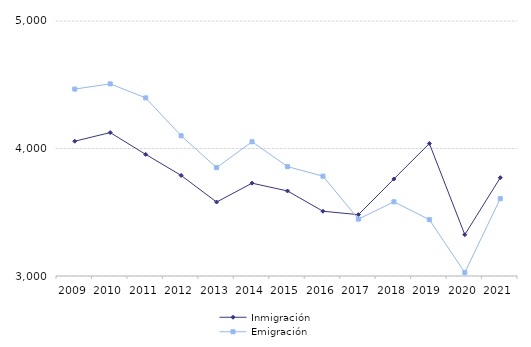
| Category | Inmigración | Emigración |
|---|---|---|
| 2009.0 | 4057 | 4466 |
| 2010.0 | 4125 | 4507 |
| 2011.0 | 3954 | 4397 |
| 2012.0 | 3789 | 4100 |
| 2013.0 | 3580 | 3850 |
| 2014.0 | 3728 | 4053 |
| 2015.0 | 3667 | 3858 |
| 2016.0 | 3508 | 3783 |
| 2017.0 | 3481 | 3446 |
| 2018.0 | 3761 | 3582 |
| 2019.0 | 4039 | 3442 |
| 2020.0 | 3324 | 3027 |
| 2021.0 | 3771 | 3607 |